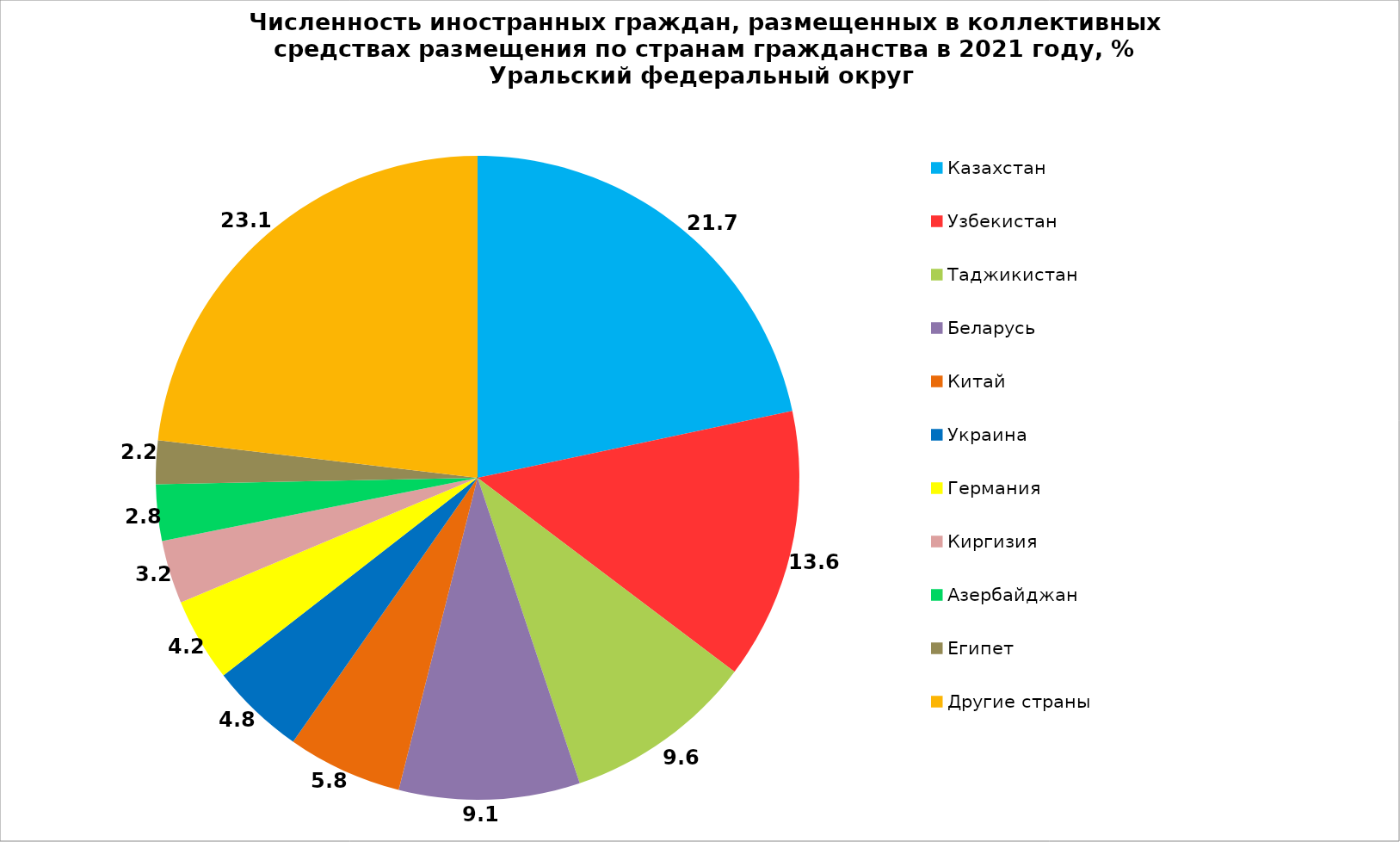
| Category | Series 0 |
|---|---|
| Казахстан | 21.666 |
| Узбекистан | 13.621 |
| Таджикистан | 9.571 |
| Беларусь | 9.086 |
| Китай | 5.772 |
| Украина | 4.771 |
| Германия | 4.193 |
| Киргизия | 3.174 |
| Азербайджан | 2.829 |
| Египет | 2.186 |
| Другие страны | 23.131 |